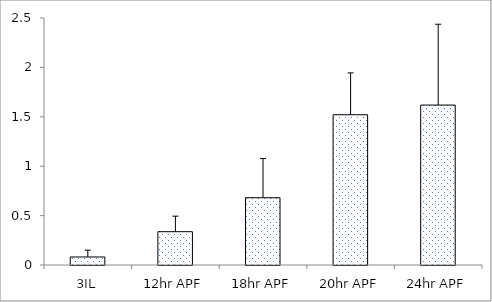
| Category | Series 0 |
|---|---|
| 3IL | 0.081 |
| 12hr APF | 0.337 |
| 18hr APF | 0.681 |
| 20hr APF | 1.521 |
| 24hr APF | 1.619 |